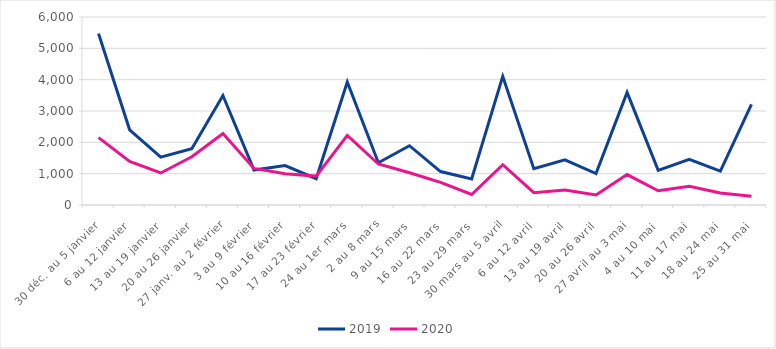
| Category | 2019 | 2020 |
|---|---|---|
| 30 déc. au 5 janvier | 5470 | 2152 |
| 6 au 12 janvier | 2400 | 1391 |
| 13 au 19 janvier | 1527 | 1022 |
| 20 au 26 janvier | 1798 | 1541 |
| 27 janv. au 2 février | 3495 | 2282 |
| 3 au 9 février | 1116 | 1167 |
| 10 au 16 février | 1260 | 995 |
| 17 au 23 février | 841 | 922 |
| 24 au 1er mars | 3928 | 2222 |
| 2 au 8 mars | 1349 | 1309 |
| 9 au 15 mars | 1893 | 1028 |
| 16 au 22 mars | 1068 | 720 |
| 23 au 29 mars | 828 | 336 |
| 30 mars au 5 avril | 4105 | 1286 |
| 6 au 12 avril | 1156 | 393 |
| 13 au 19 avril | 1440 | 476 |
| 20 au 26 avril | 1002 | 321 |
| 27 avril au 3 mai | 3595 | 971 |
| 4 au 10 mai | 1106 | 454 |
| 11 au 17 mai | 1456 | 596 |
| 18 au 24 mai | 1078 | 384 |
| 25 au 31 mai | 3215 | 277 |